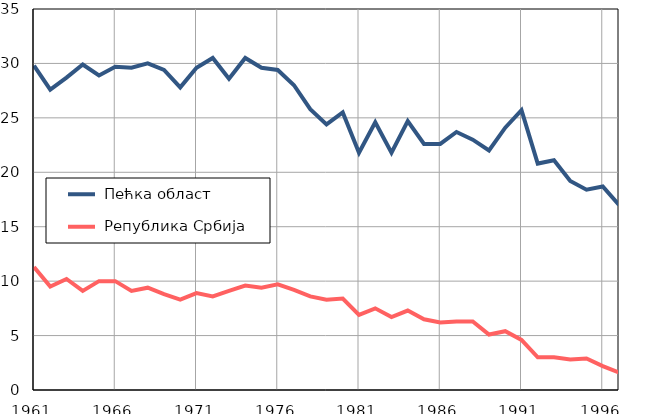
| Category |  Пећка област |  Република Србија |
|---|---|---|
| 1961.0 | 29.8 | 11.3 |
| 1962.0 | 27.6 | 9.5 |
| 1963.0 | 28.7 | 10.2 |
| 1964.0 | 29.9 | 9.1 |
| 1965.0 | 28.9 | 10 |
| 1966.0 | 29.7 | 10 |
| 1967.0 | 29.6 | 9.1 |
| 1968.0 | 30 | 9.4 |
| 1969.0 | 29.4 | 8.8 |
| 1970.0 | 27.8 | 8.3 |
| 1971.0 | 29.6 | 8.9 |
| 1972.0 | 30.5 | 8.6 |
| 1973.0 | 28.6 | 9.1 |
| 1974.0 | 30.5 | 9.6 |
| 1975.0 | 29.6 | 9.4 |
| 1976.0 | 29.4 | 9.7 |
| 1977.0 | 28 | 9.2 |
| 1978.0 | 25.8 | 8.6 |
| 1979.0 | 24.4 | 8.3 |
| 1980.0 | 25.5 | 8.4 |
| 1981.0 | 21.8 | 6.9 |
| 1982.0 | 24.6 | 7.5 |
| 1983.0 | 21.8 | 6.7 |
| 1984.0 | 24.7 | 7.3 |
| 1985.0 | 22.6 | 6.5 |
| 1986.0 | 22.6 | 6.2 |
| 1987.0 | 23.7 | 6.3 |
| 1988.0 | 23 | 6.3 |
| 1989.0 | 22 | 5.1 |
| 1990.0 | 24.1 | 5.4 |
| 1991.0 | 25.7 | 4.6 |
| 1992.0 | 20.8 | 3 |
| 1993.0 | 21.1 | 3 |
| 1994.0 | 19.2 | 2.8 |
| 1995.0 | 18.4 | 2.9 |
| 1996.0 | 18.7 | 2.2 |
| 1997.0 | 17 | 1.6 |